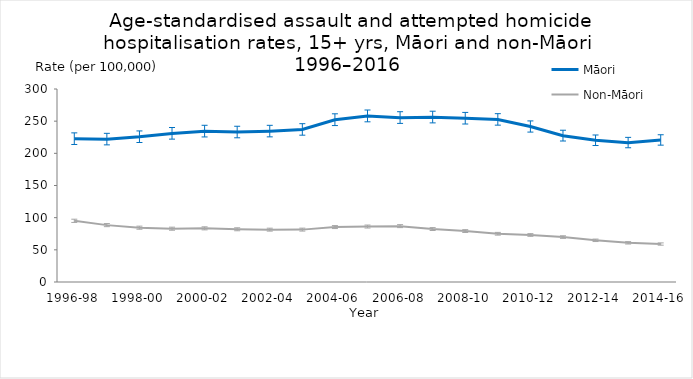
| Category | Māori | Non-Māori |
|---|---|---|
| 1996-98 | 222.641 | 95.07 |
| 1997-99 | 221.985 | 88.409 |
| 1998-00 | 225.691 | 84.382 |
| 1999-01 | 230.985 | 82.819 |
| 2000-02 | 234.402 | 83.381 |
| 2001-03 | 232.995 | 81.934 |
| 2002-04 | 234.458 | 81.338 |
| 2003-05 | 237.032 | 81.416 |
| 2004-06 | 252.178 | 85.354 |
| 2005-07 | 258.046 | 86.186 |
| 2006-08 | 255.492 | 86.826 |
| 2007-09 | 256.281 | 82.265 |
| 2008-10 | 254.486 | 79.141 |
| 2009-11 | 252.623 | 74.969 |
| 2010-12 | 241.587 | 73.059 |
| 2011-13 | 227.424 | 69.805 |
| 2012-14 | 220.206 | 64.783 |
| 2013-15 | 216.623 | 60.864 |
| 2014-16 | 220.694 | 58.988 |